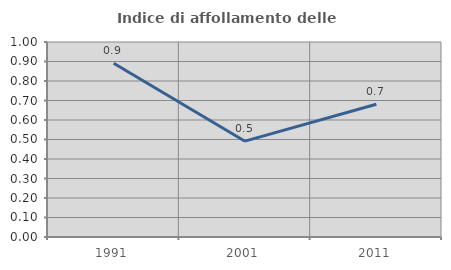
| Category | Indice di affollamento delle abitazioni  |
|---|---|
| 1991.0 | 0.891 |
| 2001.0 | 0.491 |
| 2011.0 | 0.681 |